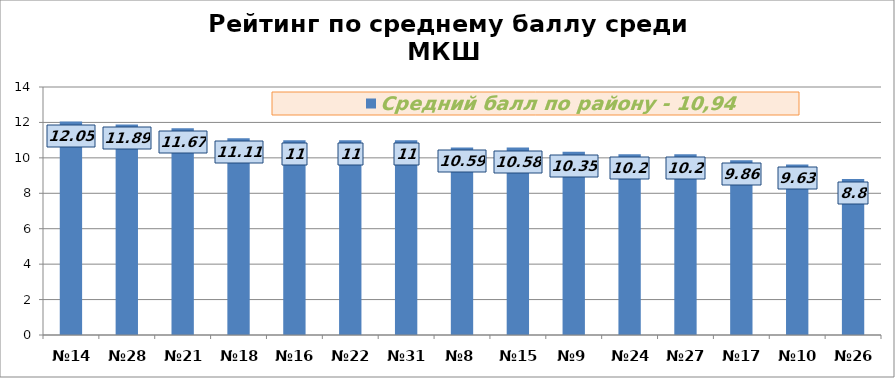
| Category | Средний балл по району - 10,94 |
|---|---|
| №14 | 12.05 |
| №28 | 11.89 |
| №21 | 11.67 |
| №18 | 11.11 |
| №16 | 11 |
| №22 | 11 |
| №31 | 11 |
| №8 | 10.59 |
| №15 | 10.58 |
| №9 | 10.35 |
| №24 | 10.2 |
| №27 | 10.2 |
| №17 | 9.86 |
| №10 | 9.63 |
| №26 | 8.8 |